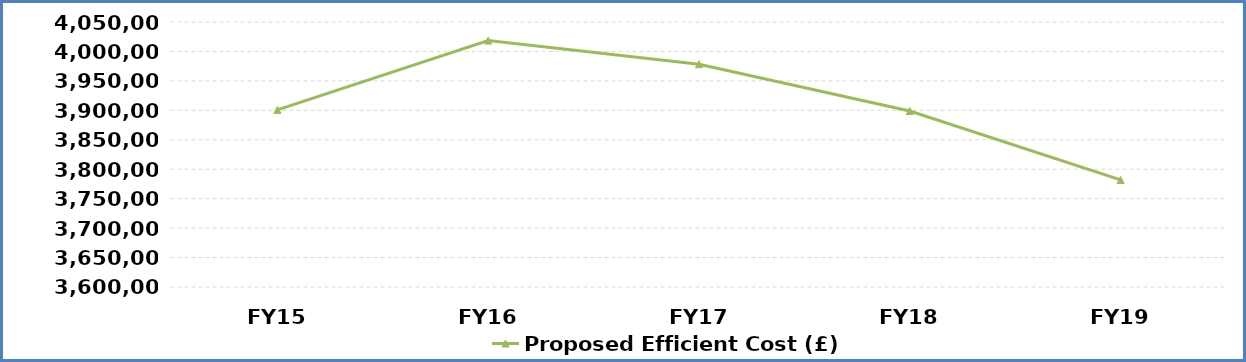
| Category | Proposed Efficient Cost (£) | Series 5 |
|---|---|---|
| FY15 | 3900713.815 |  |
| FY16 | 4018515.371 |  |
| FY17 | 3978330.217 |  |
| FY18 | 3898763.613 |  |
| FY19 | 3781800.704 |  |